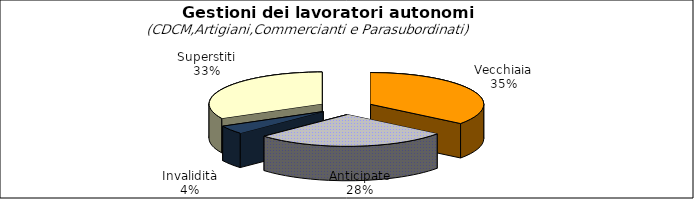
| Category | Series 0 |
|---|---|
| Vecchiaia | 63111 |
| Anticipate | 49496 |
| Invalidità | 7639 |
| Superstiti | 58182 |